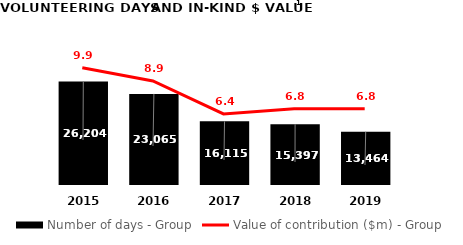
| Category | Number of days - Group |
|---|---|
| 2019.0 | 13464 |
| 2018.0 | 15397 |
| 2017.0 | 16115 |
| 2016.0 | 23065 |
| 2015.0 | 26204 |